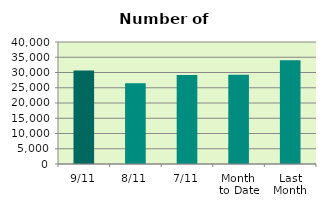
| Category | Series 0 |
|---|---|
| 9/11 | 30692 |
| 8/11 | 26486 |
| 7/11 | 29216 |
| Month 
to Date | 29244.286 |
| Last
Month | 34034.348 |